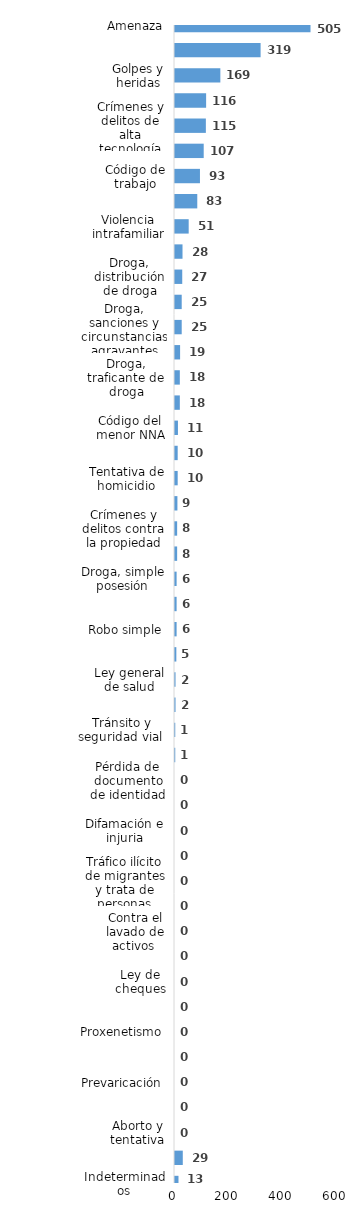
| Category | Series 0 |
|---|---|
| Amenaza | 505 |
| Robo calificado | 319 |
| Golpes y heridas | 169 |
| Estafa | 116 |
| Crímenes y delitos de alta tecnología | 115 |
| Daños y perjuicios a la cosa ajena | 107 |
| Código de trabajo | 93 |
| Abuso de confianza | 83 |
| Violencia intrafamiliar | 51 |
| Asociación de malhechores | 28 |
| Droga, distribución de droga | 27 |
| Ley de armas | 25 |
| Droga, sanciones y circunstancias agravantes | 25 |
| Violencia de género | 19 |
| Droga, traficante de droga | 18 |
| Agresión sexual | 18 |
| Código del menor NNA | 11 |
| Homicidio | 10 |
| Tentativa de homicidio | 10 |
| Falsificación | 9 |
| Crímenes y delitos contra la propiedad | 8 |
| Propiedad industrial, intelectual y derecho de autor | 8 |
| Droga, simple posesión | 6 |
| Violación sexual | 6 |
| Robo simple | 6 |
| Protección animal y tenencia responsable | 5 |
| Ley general de salud | 2 |
| Terrorismo | 2 |
| Tránsito y seguridad vial  | 1 |
| Secuestro | 1 |
| Pérdida de documento de identidad | 0 |
| Desaparición | 0 |
| Difamación e injuria | 0 |
| Conflictos sociales | 0 |
| Tráfico ilícito de migrantes y trata de personas | 0 |
| Medio ambiente y recursos naturales | 0 |
| Contra el lavado de activos  | 0 |
| Juegos de azar | 0 |
| Ley de cheques | 0 |
| Derechos humanos | 0 |
| Proxenetismo | 0 |
| Soborno | 0 |
| Prevaricación | 0 |
| Droga, delitos y sanciones | 0 |
| Aborto y tentativa | 0 |
| Otros | 29 |
| Indeterminados | 13 |